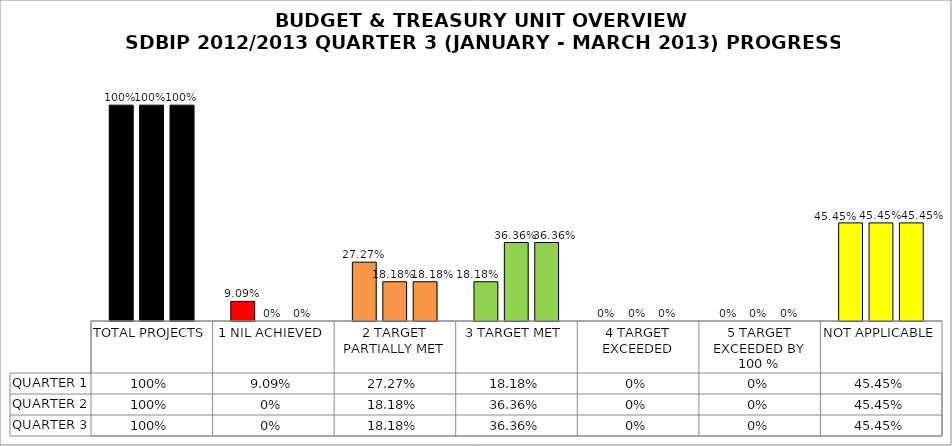
| Category | QUARTER 1 | QUARTER 2 | QUARTER 3 |
|---|---|---|---|
| TOTAL PROJECTS | 1 | 1 | 1 |
| 1 NIL ACHIEVED | 0.091 | 0 | 0 |
| 2 TARGET PARTIALLY MET | 0.273 | 0.182 | 0.182 |
| 3 TARGET MET | 0.182 | 0.364 | 0.364 |
| 4 TARGET EXCEEDED | 0 | 0 | 0 |
| 5 TARGET EXCEEDED BY 100 % | 0 | 0 | 0 |
| NOT APPLICABLE | 0.454 | 0.454 | 0.454 |